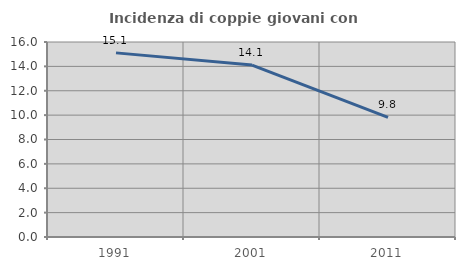
| Category | Incidenza di coppie giovani con figli |
|---|---|
| 1991.0 | 15.108 |
| 2001.0 | 14.107 |
| 2011.0 | 9.809 |